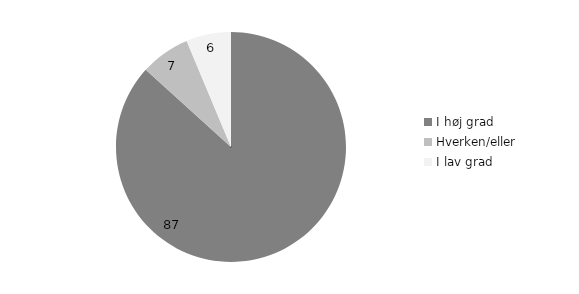
| Category | Series 0 |
|---|---|
| I høj grad | 86.7 |
| Hverken/eller  | 7 |
| I lav grad | 6.3 |